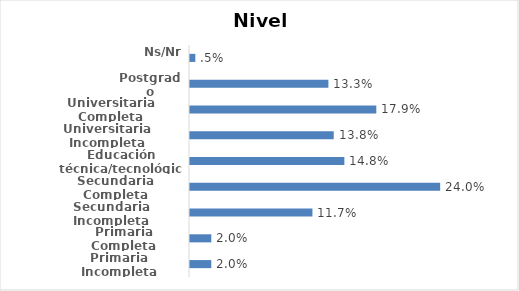
| Category | Series 0 |
|---|---|
| Primaria Incompleta | 0.02 |
| Primaria Completa | 0.02 |
| Secundaria Incompleta | 0.117 |
| Secundaria Completa | 0.24 |
| Educación técnica/tecnológica | 0.148 |
| Universitaria Incompleta | 0.138 |
| Universitaria Completa | 0.179 |
| Postgrado | 0.133 |
| Ns/Nr | 0.005 |